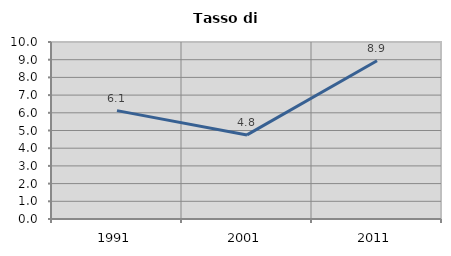
| Category | Tasso di disoccupazione   |
|---|---|
| 1991.0 | 6.124 |
| 2001.0 | 4.75 |
| 2011.0 | 8.941 |